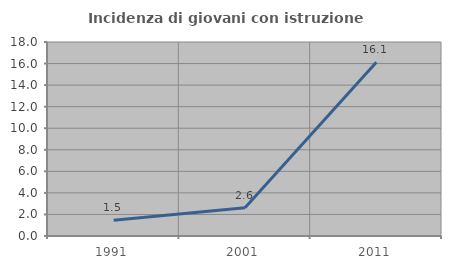
| Category | Incidenza di giovani con istruzione universitaria |
|---|---|
| 1991.0 | 1.471 |
| 2001.0 | 2.632 |
| 2011.0 | 16.129 |